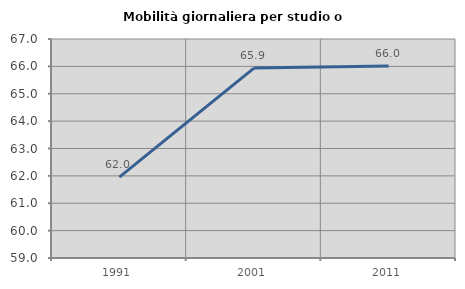
| Category | Mobilità giornaliera per studio o lavoro |
|---|---|
| 1991.0 | 61.954 |
| 2001.0 | 65.939 |
| 2011.0 | 66.016 |